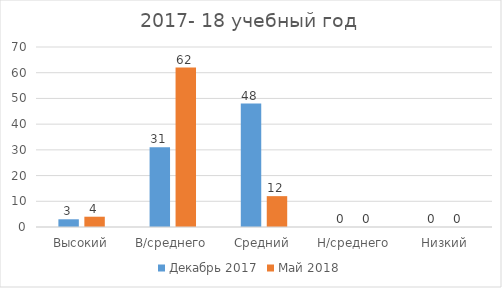
| Category | Декабрь 2017 | Май 2018 |
|---|---|---|
| Высокий | 3 | 4 |
| В/среднего | 31 | 62 |
| Средний | 48 | 12 |
| Н/среднего | 0 | 0 |
| Низкий | 0 | 0 |